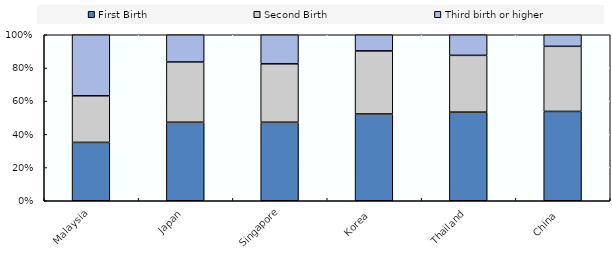
| Category | First Birth | Second Birth | Third birth or higher |
|---|---|---|---|
| Malaysia | 35.2 | 28.1 | 36.8 |
| Japan | 47.3 | 36.3 | 16.4 |
| Singapore | 47.3 | 35.2 | 17.5 |
| Korea  | 52.29 | 37.999 | 9.711 |
| Thailand | 53.4 | 34.2 | 12.4 |
| China  | 54.9 | 40 | 7.1 |